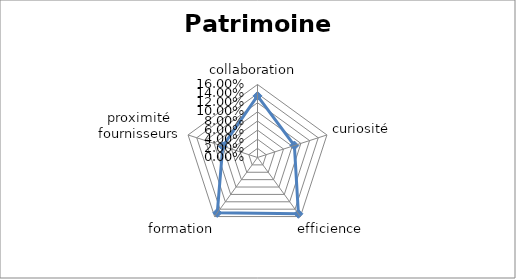
| Category | Series 0 |
|---|---|
| collaboration  | 0.135 |
| curiosité | 0.085 |
| efficience | 0.152 |
| formation | 0.15 |
| proximité fournisseurs | 0.08 |